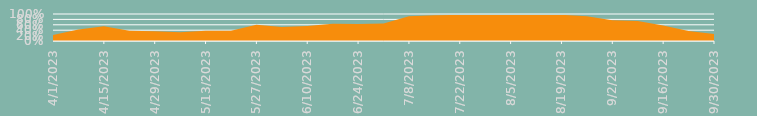
| Category | Remplissage |
|---|---|
| 4/1/23 | 0.22 |
| 4/8/23 | 0.43 |
| 4/15/23 | 0.55 |
| 4/22/23 | 0.38 |
| 4/29/23 | 0.36 |
| 5/6/23 | 0.32 |
| 5/13/23 | 0.38 |
| 5/20/23 | 0.38 |
| 5/27/23 | 0.6 |
| 6/3/23 | 0.52 |
| 6/10/23 | 0.56 |
| 6/17/23 | 0.64 |
| 6/24/23 | 0.63 |
| 7/1/23 | 0.65 |
| 7/8/23 | 0.92 |
| 7/15/23 | 0.95 |
| 7/22/23 | 0.97 |
| 7/29/23 | 0.99 |
| 8/5/23 | 0.99 |
| 8/12/23 | 0.99 |
| 8/19/23 | 0.97 |
| 8/26/23 | 0.92 |
| 9/2/23 | 0.77 |
| 9/9/23 | 0.74 |
| 9/16/23 | 0.57 |
| 9/23/23 | 0.37 |
| 9/30/23 | 0.26 |